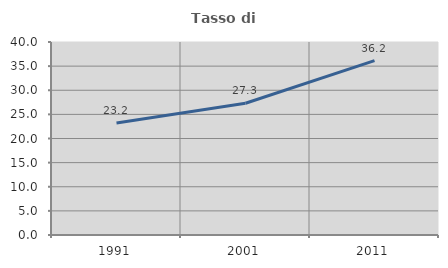
| Category | Tasso di occupazione   |
|---|---|
| 1991.0 | 23.229 |
| 2001.0 | 27.307 |
| 2011.0 | 36.155 |